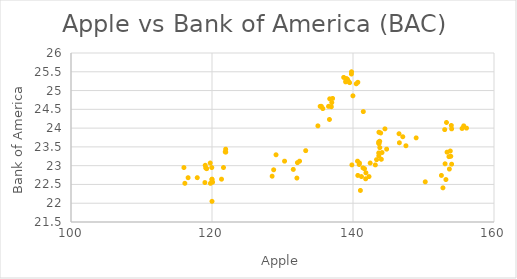
| Category | Series 0 |
|---|---|
| 116.15 | 22.53 |
| 116.02 | 22.95 |
| 116.61 | 22.68 |
| 117.91 | 22.68 |
| 118.99 | 22.55 |
| 119.11 | 22.94 |
| 119.75 | 23.07 |
| 119.25 | 22.92 |
| 119.04 | 23.01 |
| 120.0 | 22.05 |
| 119.99 | 22.63 |
| 119.78 | 22.53 |
| 120.0 | 22.64 |
| 120.08 | 22.56 |
| 119.97 | 22.95 |
| 121.88 | 23.37 |
| 121.94 | 23.44 |
| 121.95 | 23.36 |
| 121.63 | 22.95 |
| 121.35 | 22.64 |
| 128.75 | 22.89 |
| 128.53 | 22.72 |
| 129.08 | 23.29 |
| 130.29 | 23.12 |
| 131.53 | 22.9 |
| 132.04 | 22.67 |
| 132.42 | 23.12 |
| 132.12 | 23.08 |
| 133.29 | 23.4 |
| 135.02 | 24.06 |
| 135.51 | 24.58 |
| 135.34 | 24.58 |
| 135.72 | 24.52 |
| 136.7 | 24.78 |
| 137.11 | 24.79 |
| 136.53 | 24.58 |
| 136.66 | 24.23 |
| 136.93 | 24.57 |
| 136.99 | 24.68 |
| 139.79 | 25.5 |
| 138.96 | 25.23 |
| 139.78 | 25.44 |
| 139.34 | 25.25 |
| 139.52 | 25.21 |
| 139.0 | 25.26 |
| 138.68 | 25.35 |
| 139.14 | 25.31 |
| 139.2 | 25.3 |
| 138.99 | 25.32 |
| 140.46 | 25.18 |
| 140.69 | 25.22 |
| 139.99 | 24.86 |
| 141.46 | 24.44 |
| 139.84 | 23.02 |
| 141.42 | 22.94 |
| 140.92 | 23.07 |
| 140.64 | 23.12 |
| 140.88 | 23.03 |
| 143.8 | 23.48 |
| 144.12 | 23.35 |
| 143.93 | 23.87 |
| 143.66 | 23.59 |
| 143.7 | 23.59 |
| 144.77 | 23.44 |
| 144.02 | 23.17 |
| 143.66 | 23.26 |
| 143.34 | 23.16 |
| 143.17 | 23.02 |
| 141.63 | 22.92 |
| 141.8 | 22.65 |
| 141.05 | 22.34 |
| 141.83 | 22.81 |
| 141.2 | 22.71 |
| 140.68 | 22.74 |
| 142.44 | 23.07 |
| 142.27 | 22.71 |
| 143.64 | 23.63 |
| 144.53 | 23.98 |
| 143.68 | 23.89 |
| 143.79 | 23.65 |
| 143.65 | 23.34 |
| 146.58 | 23.61 |
| 147.51 | 23.53 |
| 147.06 | 23.77 |
| 146.53 | 23.85 |
| 148.96 | 23.74 |
| 153.01 | 23.96 |
| 153.99 | 23.98 |
| 153.26 | 24.15 |
| 153.95 | 24.07 |
| 156.1 | 24 |
| 155.7 | 24.06 |
| 155.47 | 23.99 |
| 150.25 | 22.57 |
| 152.54 | 22.74 |
| 153.06 | 23.05 |
| 153.99 | 23.04 |
| 153.8 | 23.39 |
| 153.34 | 23.36 |
| 153.87 | 23.25 |
| 153.61 | 23.24 |
| 153.67 | 22.91 |
| 152.76 | 22.41 |
| 153.18 | 22.63 |